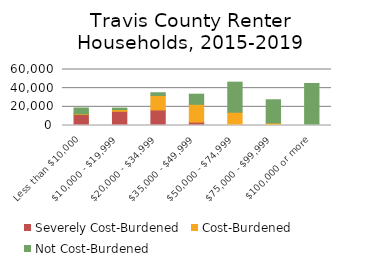
| Category | Severely Cost-Burdened | Cost-Burdened | Not Cost-Burdened |
|---|---|---|---|
|   Less than $10,000 | 11739 | 680 | 6324 |
|   $10,000 - $19,999 | 15242 | 1757 | 1611 |
|   $20,000 - $34,999 | 16651 | 15434 | 3027 |
|   $35,000 - $49,999 | 3635 | 19051 | 10866 |
|   $50,000 - $74,999 | 972 | 13261 | 32215 |
|   $75,000 - $99,999 | 147 | 2559 | 24865 |
|   $100,000 or more | 0 | 551 | 44423 |